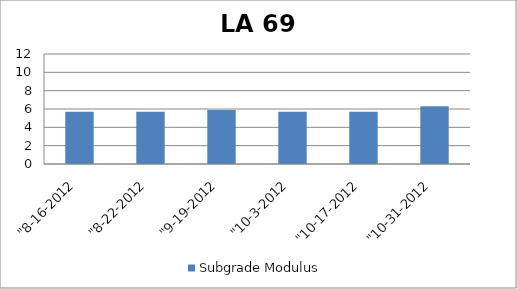
| Category | Subgrade Modulus |
|---|---|
| "8-16-2012 | 5.7 |
| "8-22-2012 | 5.7 |
| "9-19-2012 | 5.9 |
| "10-3-2012 | 5.7 |
| "10-17-2012 | 5.7 |
| "10-31-2012 | 6.3 |